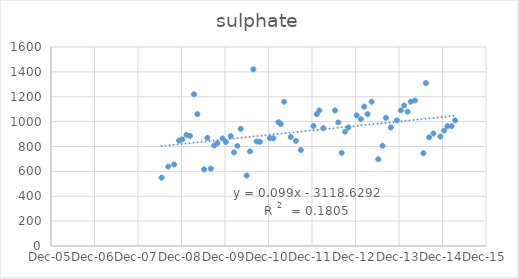
| Category | Series 0 |
|---|---|
| 39618.0 | 550 |
| 39674.0 | 639 |
| 39723.0 | 656 |
| 39764.0 | 848 |
| 39792.0 | 857 |
| 39827.0 | 893 |
| 39856.0 | 885 |
| 39890.0 | 1220 |
| 39918.0 | 1060 |
| 39974.0 | 616 |
| 40002.0 | 870 |
| 40031.0 | 622 |
| 40059.0 | 808 |
| 40087.0 | 827 |
| 40129.0 | 865 |
| 40157.0 | 836 |
| 40198.0 | 884 |
| 40226.0 | 753 |
| 40282.0 | 942 |
| 40254.0 | 805 |
| 40332.0 | 567 |
| 40359.0 | 761 |
| 40388.0 | 1420 |
| 40415.0 | 841 |
| 40443.0 | 838 |
| 40527.0 | 868 |
| 40556.0 | 866 |
| 40598.0 | 996 |
| 40618.0 | 981 |
| 40646.0 | 1160 |
| 40702.0 | 876 |
| 40745.0 | 845 |
| 40787.0 | 772 |
| 40892.0 | 965 |
| 40920.0 | 1060 |
| 40941.0 | 1090 |
| 40975.0 | 948 |
| 41073.0 | 1090 |
| 41101.0 | 994 |
| 41129.0 | 749 |
| 41158.0 | 919 |
| 41186.0 | 954 |
| 41255.0 | 1050 |
| 41290.0 | 1020 |
| 41318.0 | 1120 |
| 41346.0 | 1060 |
| 41381.0 | 1160 |
| 41436.0 | 698 |
| 41472.0 | 806 |
| 41500.0 | 1030 |
| 41541.0 | 953 |
| 41592.0 | 1010 |
| 41626.0 | 1090 |
| 41653.0 | 1130 |
| 41682.0 | 1080 |
| 41709.0 | 1160 |
| 41743.0 | 1170 |
| 41815.0 | 746 |
| 41836.0 | 1310 |
| 41863.0 | 874 |
| 41899.0 | 905 |
| 41957.0 | 880 |
| 41989.0 | 928 |
| 42017.0 | 964 |
| 42052.0 | 963 |
| 42080.0 | 1010 |